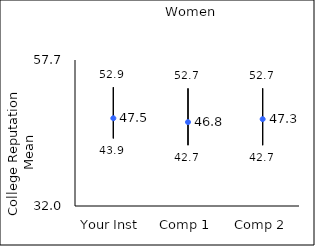
| Category | 25th percentile | 75th percentile | Mean |
|---|---|---|---|
| Your Inst | 43.9 | 52.9 | 47.45 |
| Comp 1 | 42.7 | 52.7 | 46.77 |
| Comp 2 | 42.7 | 52.7 | 47.29 |